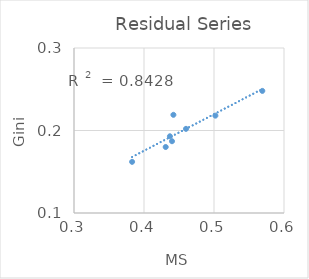
| Category | res-gini |
|---|---|
| 0.437 | 0.193 |
| 0.44 | 0.187 |
| 0.569 | 0.248 |
| 0.502 | 0.218 |
| 0.383 | 0.162 |
| 0.442 | 0.219 |
| 0.46 | 0.202 |
| 0.431 | 0.18 |